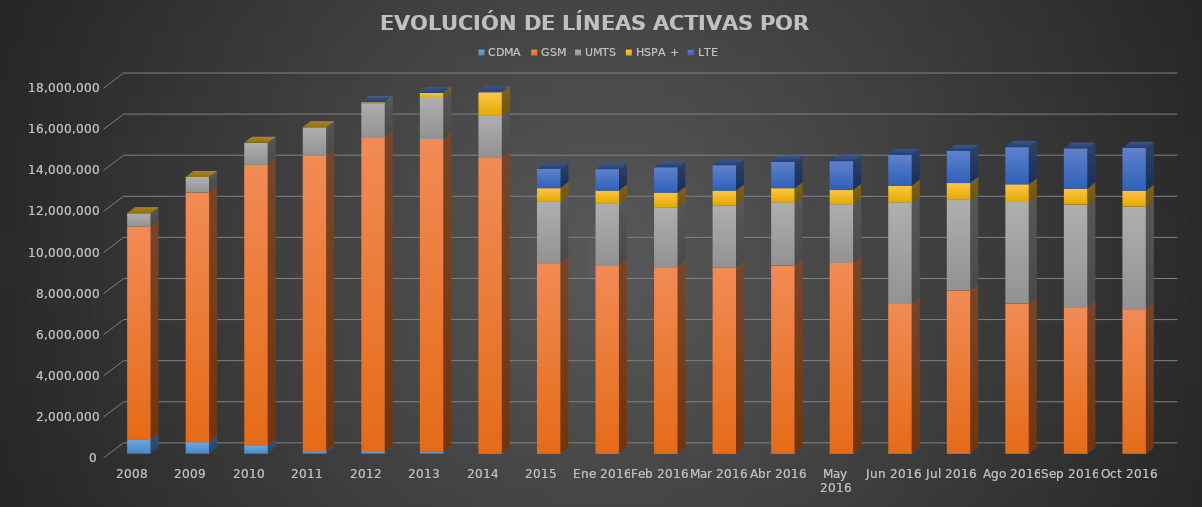
| Category | CDMA | GSM | UMTS | HSPA + | LTE |
|---|---|---|---|---|---|
| 2008 | 688357 | 10346902 | 656989 | 0 | 0 |
| 2009 | 544313 | 12151710 | 758577 | 0 | 0 |
| 2010 | 389834 | 13657394 | 1071603 | 0 | 0 |
| 2011 | 102115 | 14379423 | 1393020 | 0 | 0 |
| 2012 | 75179 | 15310006 | 1658596 | 43082 | 0 |
| 2013 | 83748 | 15215287 | 2043321 | 199398 | 0 |
| 2014 | 3009 | 14418144 | 2006405 | 1148823 | 28176 |
| 2015 | 0 | 9252920 | 3019889 | 636488 | 949723 |
| Ene 2016 | 0 | 9151434 | 3014450 | 624647 | 1043430 |
| Feb 2016 | 0 | 9060717 | 2926831 | 701642 | 1233429 |
| Mar 2016 | 0 | 9039373 | 3046404 | 700383 | 1236509 |
| Abr 2016 | 0 | 9142187 | 3074932 | 692454 | 1281921 |
| May 2016 | 0 | 9271274 | 2848793 | 698157 | 1408813 |
| Jun 2016 | 0 | 7271608 | 4947300 | 802451 | 1518705 |
| Jul 2016 | 0 | 7928586 | 4415084 | 816197 | 1561638 |
| Ago 2016 | 0 | 7294185 | 4943288 | 853938 | 1816804 |
| Sep 2016 | 0 | 7107870 | 5008550 | 769882 | 1958347 |
| Oct 2016 | 0 | 7013503 | 5005134 | 762617 | 2093121 |